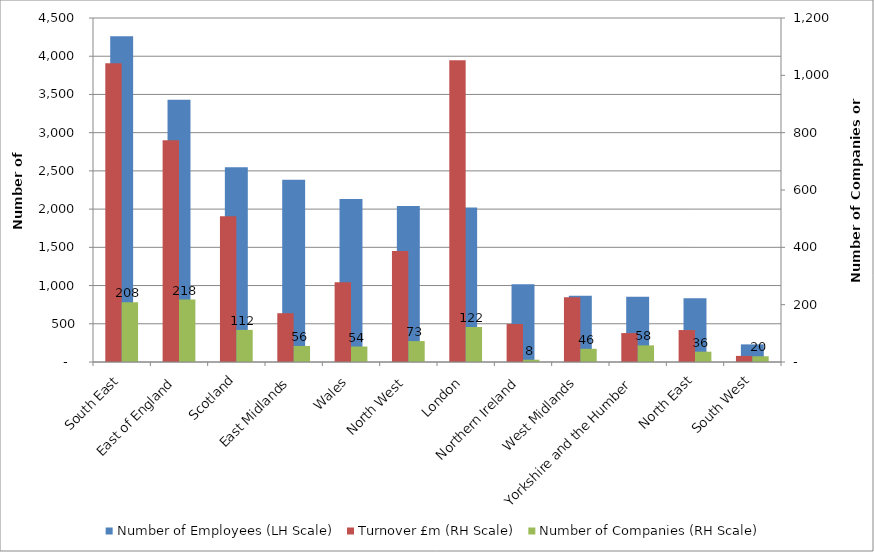
| Category | Number of Employees (LH Scale) |
|---|---|
| South East | 4260.3 |
| East of England | 3429.43 |
| Scotland | 2549.1 |
| East Midlands | 2383.6 |
| Wales | 2131.5 |
| North West | 2039.5 |
| London | 2020.9 |
| Northern Ireland | 1018 |
| West Midlands | 867.5 |
| Yorkshire and the Humber | 854.2 |
| North East | 833.7 |
| South West | 230.5 |